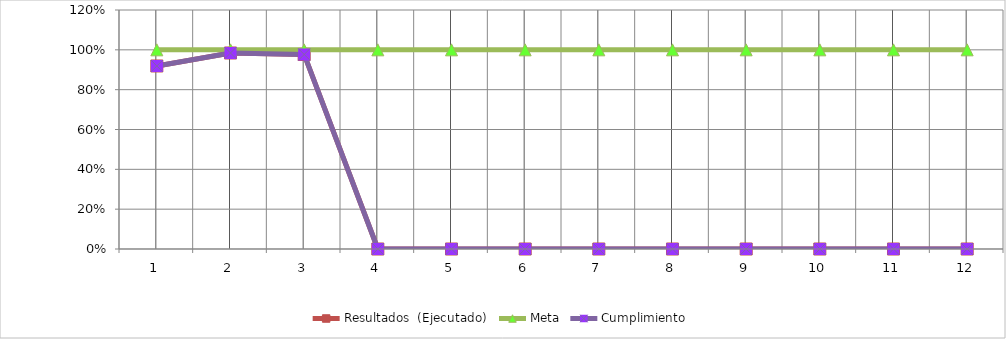
| Category | Resultados  (Ejecutado) | Meta | Cumplimiento |
|---|---|---|---|
| 0 | 0.919 | 1 | 0.919 |
| 1 | 0.984 | 1 | 0.984 |
| 2 | 0.977 | 1 | 0.977 |
| 3 | 0 | 1 | 0 |
| 4 | 0 | 1 | 0 |
| 5 | 0 | 1 | 0 |
| 6 | 0 | 1 | 0 |
| 7 | 0 | 1 | 0 |
| 8 | 0 | 1 | 0 |
| 9 | 0 | 1 | 0 |
| 10 | 0 | 1 | 0 |
| 11 | 0 | 1 | 0 |